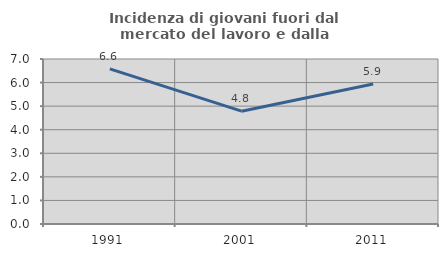
| Category | Incidenza di giovani fuori dal mercato del lavoro e dalla formazione  |
|---|---|
| 1991.0 | 6.579 |
| 2001.0 | 4.787 |
| 2011.0 | 5.941 |